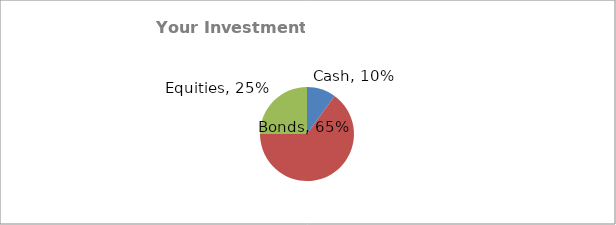
| Category | Series 0 |
|---|---|
| Cash | 0.1 |
| Bonds | 0.65 |
| Equities | 0.25 |